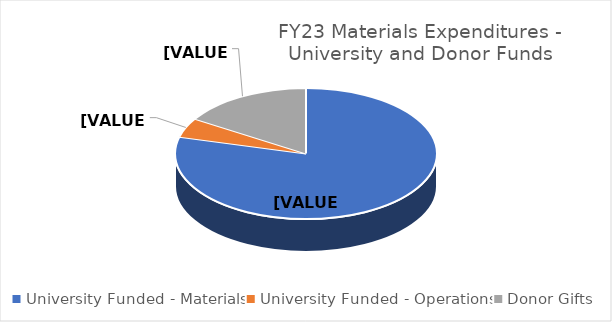
| Category | Series 0 |
|---|---|
| University Funded - Materials | 0.791 |
| University Funded - Operations | 0.048 |
| Donor Gifts | 0.161 |